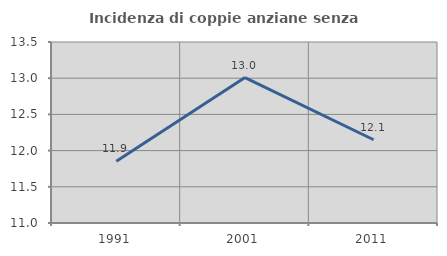
| Category | Incidenza di coppie anziane senza figli  |
|---|---|
| 1991.0 | 11.852 |
| 2001.0 | 13.008 |
| 2011.0 | 12.15 |